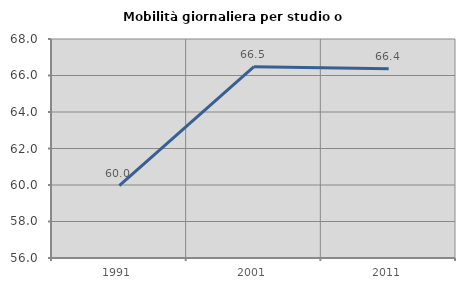
| Category | Mobilità giornaliera per studio o lavoro |
|---|---|
| 1991.0 | 59.965 |
| 2001.0 | 66.484 |
| 2011.0 | 66.375 |